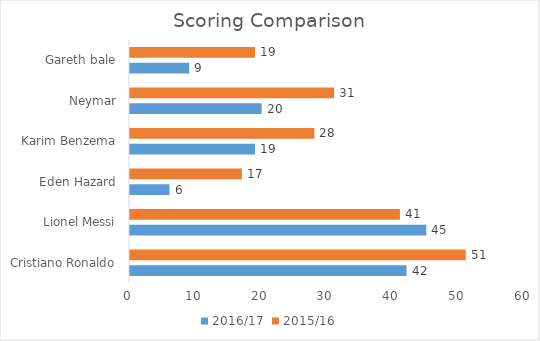
| Category | 2016/17 | 2015/16 |
|---|---|---|
| Cristiano Ronaldo | 42 | 51 |
| Lionel Messi | 45 | 41 |
| Eden Hazard | 6 | 17 |
| Karim Benzema | 19 | 28 |
| Neymar | 20 | 31 |
| Gareth bale | 9 | 19 |